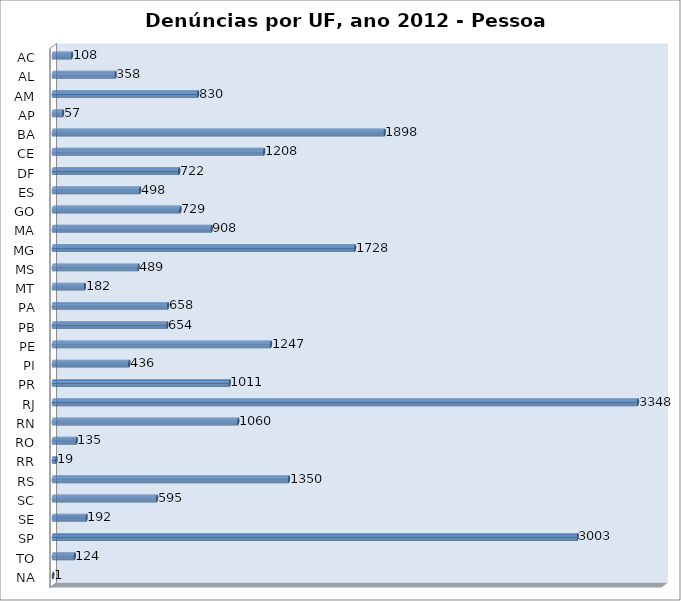
| Category | Series 0 |
|---|---|
| AC | 108 |
| AL | 358 |
| AM | 830 |
| AP | 57 |
| BA | 1898 |
| CE | 1208 |
| DF | 722 |
| ES | 498 |
| GO | 729 |
| MA | 908 |
| MG | 1728 |
| MS | 489 |
| MT | 182 |
| PA | 658 |
| PB | 654 |
| PE | 1247 |
| PI | 436 |
| PR | 1011 |
| RJ | 3348 |
| RN | 1060 |
| RO | 135 |
| RR | 19 |
| RS | 1350 |
| SC | 595 |
| SE | 192 |
| SP | 3003 |
| TO | 124 |
| NA | 1 |